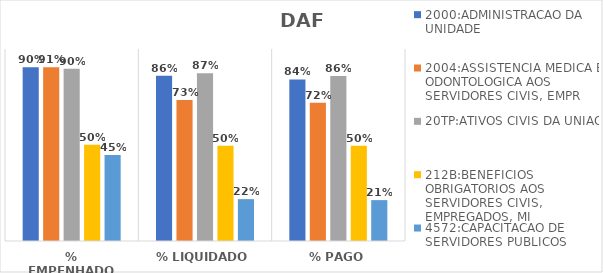
| Category | 2000:ADMINISTRACAO DA UNIDADE | 2004:ASSISTENCIA MEDICA E ODONTOLOGICA AOS SERVIDORES CIVIS, EMPR | 20TP:ATIVOS CIVIS DA UNIAO | 212B:BENEFICIOS OBRIGATORIOS AOS SERVIDORES CIVIS, EMPREGADOS, MI | 4572:CAPACITACAO DE SERVIDORES PUBLICOS FEDERAIS EM PROCESSO DE Q |
|---|---|---|---|---|---|
| % EMPENHADO | 0.904 | 0.906 | 0.898 | 0.501 | 0.448 |
| % LIQUIDADO | 0.861 | 0.735 | 0.873 | 0.496 | 0.218 |
| % PAGO | 0.842 | 0.72 | 0.86 | 0.496 | 0.213 |